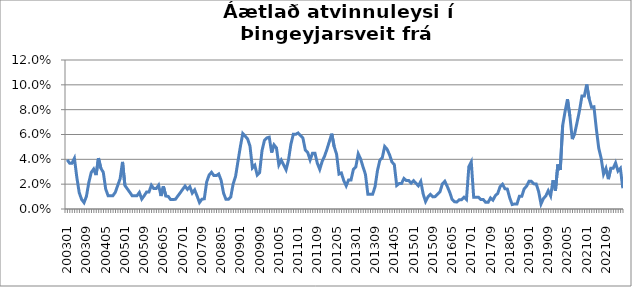
| Category | Series 0 |
|---|---|
| 200301 | 0.04 |
| 200302 | 0.037 |
| 200303 | 0.037 |
| 200304 | 0.041 |
| 200305 | 0.026 |
| 200306 | 0.013 |
| 200307 | 0.008 |
| 200308 | 0.005 |
| 200309 | 0.01 |
| 200310 | 0.021 |
| 200311 | 0.029 |
| 200312 | 0.032 |
| 200401 | 0.027 |
| 200402 | 0.041 |
| 200403 | 0.033 |
| 200404 | 0.03 |
| 200405 | 0.016 |
| 200406 | 0.011 |
| 200407 | 0.011 |
| 200408 | 0.011 |
| 200409 | 0.013 |
| 200410 | 0.019 |
| 200411 | 0.024 |
| 200412 | 0.038 |
| 200501 | 0.019 |
| 200502 | 0.016 |
| 200503 | 0.014 |
| 200504 | 0.011 |
| 200505 | 0.011 |
| 200506 | 0.011 |
| 200507 | 0.013 |
| 200508 | 0.008 |
| 200509 | 0.011 |
| 200510 | 0.014 |
| 200511 | 0.014 |
| 200512 | 0.019 |
| 200601 | 0.016 |
| 200602 | 0.016 |
| 200603 | 0.019 |
| 200604 | 0.01 |
| 200605 | 0.018 |
| 200606 | 0.01 |
| 200607 | 0.01 |
| 200608 | 0.008 |
| 200609 | 0.008 |
| 200610 | 0.008 |
| 200611 | 0.01 |
| 200612 | 0.013 |
| 200701 | 0.016 |
| 200702 | 0.018 |
| 200703 | 0.016 |
| 200704 | 0.018 |
| 200705 | 0.013 |
| 200706 | 0.015 |
| 200707 | 0.01 |
| 200708 | 0.005 |
| 200709 | 0.008 |
| 200710 | 0.008 |
| 200711 | 0.022 |
| 200712 | 0.027 |
| 200801 | 0.03 |
| 200802 | 0.027 |
| 200803 | 0.027 |
| 200804 | 0.028 |
| 200805 | 0.023 |
| 200806 | 0.013 |
| 200807 | 0.008 |
| 200808 | 0.008 |
| 200809 | 0.01 |
| 200810 | 0.02 |
| 200811 | 0.026 |
| 200812 | 0.038 |
| 200901 | 0.05 |
| 200902 | 0.061 |
| 200903 | 0.059 |
| 200904 | 0.056 |
| 200905 | 0.051 |
| 200906 | 0.033 |
| 200907 | 0.035 |
| 200908 | 0.027 |
| 200909 | 0.029 |
| 200910 | 0.047 |
| 200911 | 0.055 |
| 200912 | 0.057 |
| 201001 | 0.058 |
| 201002 | 0.045 |
| 201003 | 0.052 |
| 201004 | 0.049 |
| 201005 | 0.035 |
| 201006 | 0.039 |
| 201007 | 0.036 |
| 201008 | 0.032 |
| 201009 | 0.039 |
| 201010 | 0.052 |
| 201011 | 0.06 |
| 201012 | 0.06 |
| 201101 | 0.061 |
| 201102 | 0.059 |
| 201103 | 0.057 |
| 201104 | 0.047 |
| 201105 | 0.045 |
| 201106 | 0.04 |
| 201107 | 0.045 |
| 201108 | 0.045 |
| 201109 | 0.037 |
| 201110 | 0.032 |
| 201111 | 0.038 |
| 201112 | 0.043 |
| 201201 | 0.048 |
| 201202 | 0.054 |
| 201203 | 0.061 |
| 201204 | 0.05 |
| 201205 | 0.044 |
| 201206 | 0.028 |
| 201207 | 0.029 |
| 201208 | 0.023 |
| 201209 | 0.019 |
| 201210 | 0.023 |
| 201211 | 0.023 |
| 201212 | 0.032 |
| 201301 | 0.034 |
| 201302 | 0.044 |
| 201303 | 0.04 |
| 201304 | 0.034 |
| 201305 | 0.028 |
| 201306 | 0.012 |
| 201307 | 0.012 |
| 201308 | 0.012 |
| 201309 | 0.018 |
| 201310 | 0.031 |
| 201311 | 0.039 |
| 201312 | 0.041 |
| 201401 | 0.05 |
| 201402 | 0.048 |
| 201403 | 0.044 |
| 201404 | 0.038 |
| 201405 | 0.036 |
| 201406 | 0.019 |
| 201407 | 0.02 |
| 201408 | 0.02 |
| 201409 | 0.025 |
| 201410 | 0.023 |
| 201411 | 0.023 |
| 201412 | 0.021 |
| 201501 | 0.023 |
| 201502 | 0.021 |
| 201503 | 0.019 |
| 201504 | 0.022 |
| 201505 | 0.012 |
| 201506 | 0.006 |
| 201507 | 0.01 |
| 201508 | 0.012 |
| 201509 | 0.01 |
| 201510 | 0.01 |
| 201511 | 0.012 |
| 201512 | 0.014 |
| 201601 | 0.02 |
| 201602 | 0.022 |
| 201603 | 0.018 |
| 201604 | 0.014 |
| 201605 | 0.008 |
| 201606 | 0.006 |
| 201607 | 0.006 |
| 201608 | 0.008 |
| 201609 | 0.008 |
| 201610 | 0.01 |
| 201611 | 0.008 |
| 201612 | 0.034 |
| 201701 | 0.038 |
| 201702 | 0.009 |
| 201703 | 0.009 |
| 201704 | 0.009 |
| 201705 | 0.008 |
| 201706 | 0.008 |
| 201707 | 0.005 |
| 201708 | 0.005 |
| 201709 | 0.009 |
| 201710 | 0.007 |
| 201711 | 0.011 |
| 201712 | 0.013 |
| 201801 | 0.018 |
| 201802 | 0.02 |
| 201803 | 0.016 |
| 201804 | 0.016 |
| 201805 | 0.009 |
| 201806 | 0.004 |
| 201807 | 0.004 |
| 201808 | 0.004 |
| 201809 | 0.01 |
| 201810 | 0.01 |
| 201811 | 0.016 |
| 201812 | 0.018 |
| 201901 | 0.022 |
| 201902 | 0.022 |
| 201903 | 0.02 |
| 201904 | 0.02 |
| 201905 | 0.014 |
| 201906 | 0.004 |
| 201907 | 0.008 |
| 201908 | 0.011 |
| 201909 | 0.015 |
| 201910 | 0.011 |
| 201911 | 0.023 |
| 201912 | 0.015 |
| 202001 | 0.036 |
| 202002 | 0.031 |
| 202003 | 0.067 |
| 202004 | 0.078 |
| 202005 | 0.088 |
| 202006 | 0.075 |
| 202007 | 0.056 |
| 202008 | 0.061 |
| 202009 | 0.07 |
| 202010 | 0.079 |
| 202011 | 0.091 |
| 202012 | 0.091 |
| 202101 | 0.1 |
| 202102 | 0.089 |
| 202103 | 0.082 |
| 202104 | 0.082 |
| 202105 | 0.065 |
| 202106 | 0.049 |
| 202107 | 0.041 |
| 202108 | 0.028 |
| 202109 | 0.033 |
| 202110 | 0.024 |
| 202111 | 0.033 |
| 202112 | 0.033 |
| 202201 | 0.037 |
| 202202 | 0.031 |
| 202203 | 0.033 |
| 202204 | 0.017 |